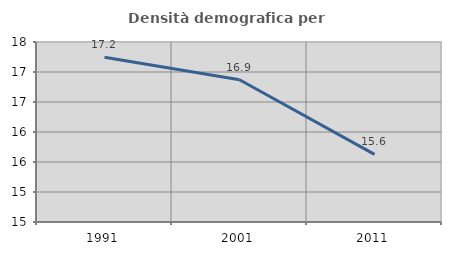
| Category | Densità demografica |
|---|---|
| 1991.0 | 17.245 |
| 2001.0 | 16.87 |
| 2011.0 | 15.627 |